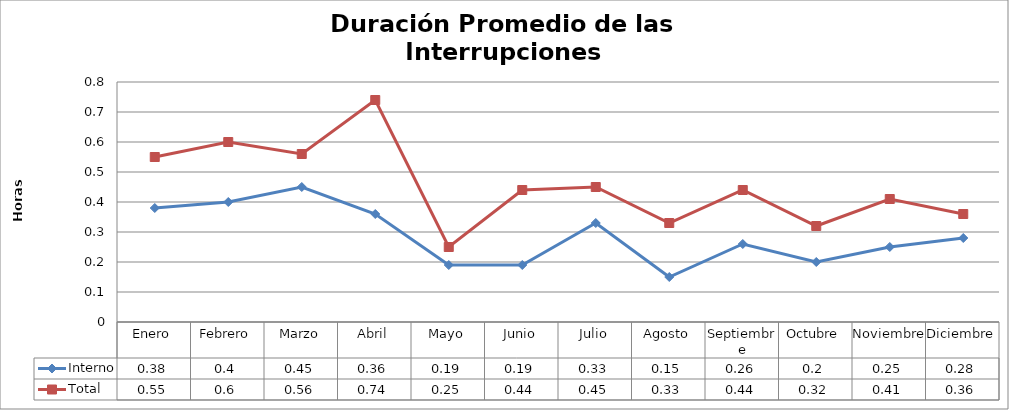
| Category | Interno | Total |
|---|---|---|
| Enero | 0.38 | 0.55 |
| Febrero | 0.4 | 0.6 |
| Marzo | 0.45 | 0.56 |
| Abril | 0.36 | 0.74 |
| Mayo | 0.19 | 0.25 |
| Junio | 0.19 | 0.44 |
| Julio | 0.33 | 0.45 |
| Agosto | 0.15 | 0.33 |
| Septiembre | 0.26 | 0.44 |
| Octubre | 0.2 | 0.32 |
| Noviembre | 0.25 | 0.41 |
| Diciembre | 0.28 | 0.36 |